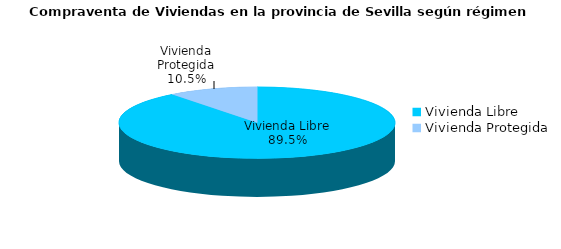
| Category | Series 0 | Series 1 |
|---|---|---|
| Vivienda Libre | 1013 | 0.895 |
| Vivienda Protegida | 119 | 0.105 |